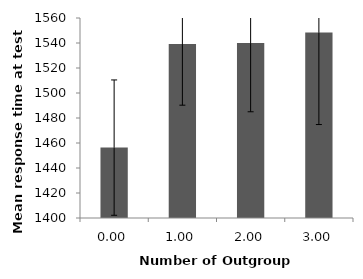
| Category | Number of Outgroup Features |
|---|---|
| 0.0 | 1456.311 |
| 1.0 | 1539.156 |
| 2.0 | 1539.91 |
| 3.0 | 1548.379 |